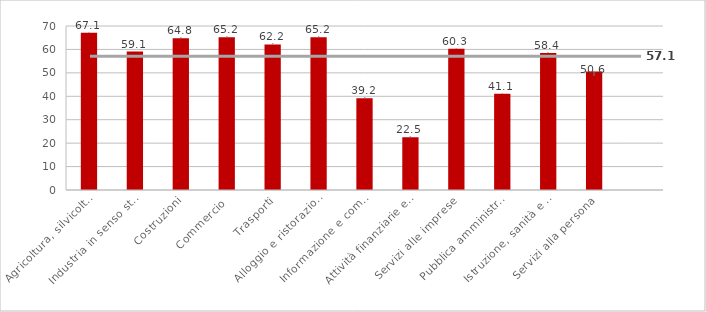
| Category | Series 0 |
|---|---|
| Agricoltura, silvicoltura e pesca | 67.12 |
| Industria in senso stretto | 59.07 |
| Costruzioni | 64.82 |
| Commercio | 65.22 |
| Trasporti | 62.15 |
| Alloggio e ristorazione | 65.23 |
| Informazione e comunicazione | 39.17 |
| Attività finanziarie e assicurative | 22.53 |
| Servizi alle imprese | 60.25 |
| Pubblica amministrazione | 41.08 |
| Istruzione, sanità e assistenza sociale | 58.43 |
| Servizi alla persona | 50.58 |